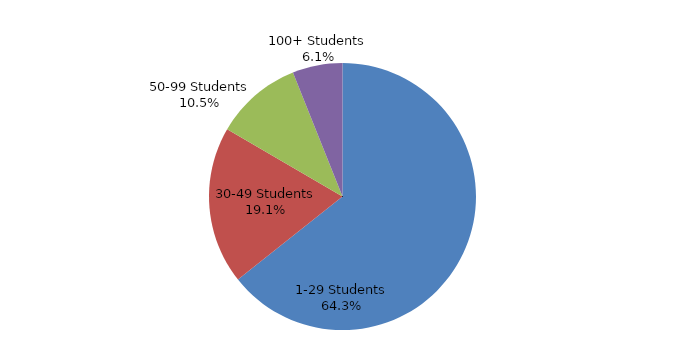
| Category | Series 0 |
|---|---|
| 1-29 Students | 0.643 |
| 30-49 Students | 0.191 |
| 50-99 | 0.105 |
| 100+ Students | 0.061 |